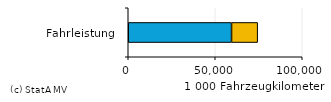
| Category | Öffentliche Unternehmen | Private und gemischtwirtschaftliche Unternehmen |
|---|---|---|
| 0 | 59366 | 15011 |